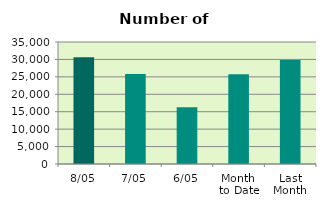
| Category | Series 0 |
|---|---|
| 8/05 | 30614 |
| 7/05 | 25796 |
| 6/05 | 16266 |
| Month 
to Date | 25736.8 |
| Last
Month | 29833 |